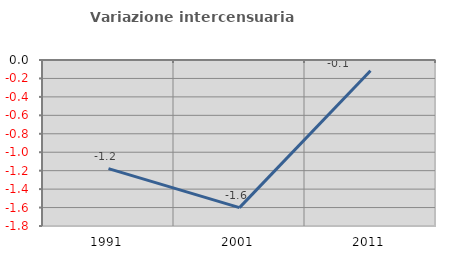
| Category | Variazione intercensuaria annua |
|---|---|
| 1991.0 | -1.178 |
| 2001.0 | -1.601 |
| 2011.0 | -0.117 |